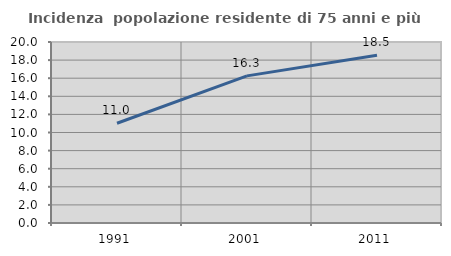
| Category | Incidenza  popolazione residente di 75 anni e più |
|---|---|
| 1991.0 | 11.02 |
| 2001.0 | 16.257 |
| 2011.0 | 18.543 |